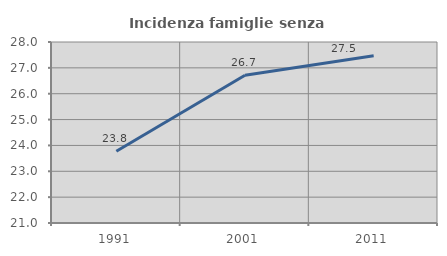
| Category | Incidenza famiglie senza nuclei |
|---|---|
| 1991.0 | 23.776 |
| 2001.0 | 26.712 |
| 2011.0 | 27.465 |